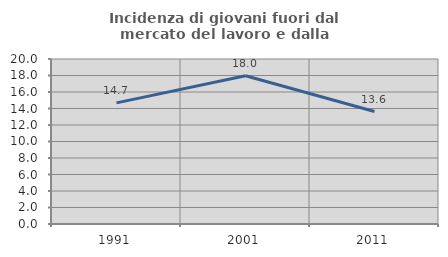
| Category | Incidenza di giovani fuori dal mercato del lavoro e dalla formazione  |
|---|---|
| 1991.0 | 14.679 |
| 2001.0 | 17.963 |
| 2011.0 | 13.629 |